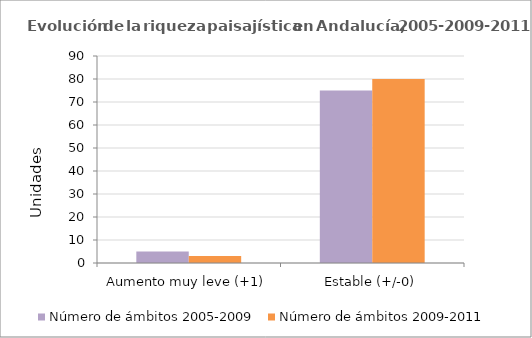
| Category | Número de ámbitos 2005-2009 | Número de ámbitos 2009-2011 |
|---|---|---|
| Aumento muy leve (+1) | 5 | 3 |
| Estable (+/-0) | 75 | 80 |